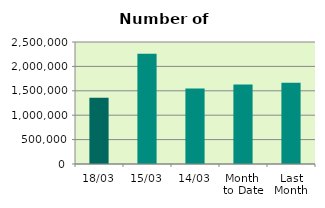
| Category | Series 0 |
|---|---|
| 18/03 | 1358772 |
| 15/03 | 2258068 |
| 14/03 | 1545466 |
| Month 
to Date | 1627124.333 |
| Last
Month | 1666801.1 |